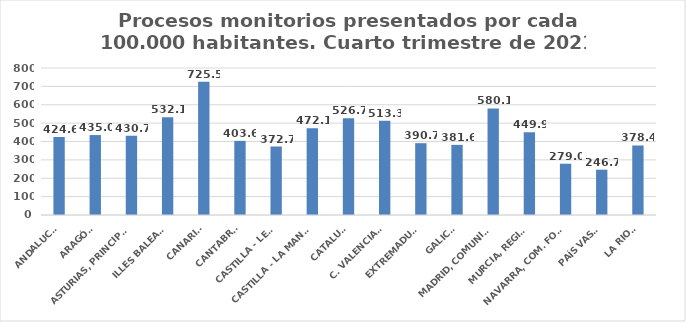
| Category | Series 0 |
|---|---|
| ANDALUCÍA | 424.557 |
| ARAGÓN | 434.982 |
| ASTURIAS, PRINCIPADO | 430.721 |
| ILLES BALEARS | 532.136 |
| CANARIAS | 725.513 |
| CANTABRIA | 403.588 |
| CASTILLA - LEÓN | 372.744 |
| CASTILLA - LA MANCHA | 472.052 |
| CATALUÑA | 526.743 |
| C. VALENCIANA | 513.292 |
| EXTREMADURA | 390.75 |
| GALICIA | 381.578 |
| MADRID, COMUNIDAD | 580.085 |
| MURCIA, REGIÓN | 449.922 |
| NAVARRA, COM. FORAL | 279.047 |
| PAÍS VASCO | 246.658 |
| LA RIOJA | 378.366 |